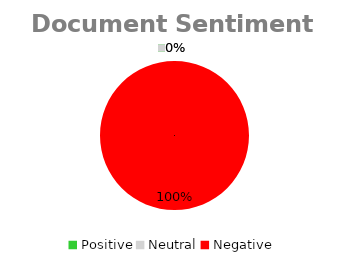
| Category | Document Sentiment Total |
|---|---|
| Positive | 0 |
| Neutral | 0 |
| Negative | 19 |